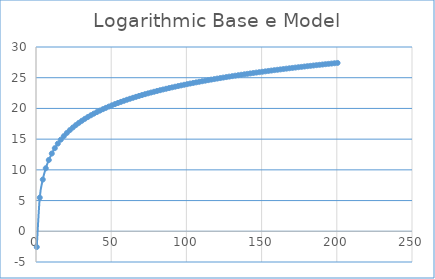
| Category | Series 0 |
|---|---|
| 0.5 | -2.566 |
| 2.5 | 5.481 |
| 4.5 | 8.42 |
| 6.5 | 10.259 |
| 8.5 | 11.6 |
| 10.5 | 12.657 |
| 12.5 | 13.529 |
| 14.5 | 14.271 |
| 16.5 | 14.917 |
| 18.5 | 15.489 |
| 20.5 | 16.002 |
| 22.5 | 16.468 |
| 24.5 | 16.893 |
| 26.5 | 17.286 |
| 28.5 | 17.65 |
| 30.5 | 17.989 |
| 32.5 | 18.306 |
| 34.5 | 18.605 |
| 36.5 | 18.887 |
| 38.5 | 19.153 |
| 40.5 | 19.407 |
| 42.5 | 19.648 |
| 44.5 | 19.877 |
| 46.5 | 20.097 |
| 48.5 | 20.308 |
| 50.5 | 20.51 |
| 52.5 | 20.704 |
| 54.5 | 20.891 |
| 56.5 | 21.071 |
| 58.5 | 21.245 |
| 60.5 | 21.413 |
| 62.5 | 21.576 |
| 64.5 | 21.733 |
| 66.5 | 21.886 |
| 68.5 | 22.034 |
| 70.5 | 22.178 |
| 72.5 | 22.318 |
| 74.5 | 22.454 |
| 76.5 | 22.586 |
| 78.5 | 22.715 |
| 80.5 | 22.841 |
| 82.5 | 22.964 |
| 84.5 | 23.084 |
| 86.5 | 23.201 |
| 88.5 | 23.315 |
| 90.5 | 23.427 |
| 92.5 | 23.536 |
| 94.5 | 23.643 |
| 96.5 | 23.748 |
| 98.5 | 23.85 |
| 100.5 | 23.951 |
| 102.5 | 24.049 |
| 104.5 | 24.146 |
| 106.5 | 24.241 |
| 108.5 | 24.334 |
| 110.5 | 24.425 |
| 112.5 | 24.515 |
| 114.5 | 24.603 |
| 116.5 | 24.689 |
| 118.5 | 24.775 |
| 120.5 | 24.858 |
| 122.5 | 24.941 |
| 124.5 | 25.022 |
| 126.5 | 25.101 |
| 128.5 | 25.18 |
| 130.5 | 25.257 |
| 132.5 | 25.333 |
| 134.5 | 25.408 |
| 136.5 | 25.482 |
| 138.5 | 25.554 |
| 140.5 | 25.626 |
| 142.5 | 25.697 |
| 144.5 | 25.766 |
| 146.5 | 25.835 |
| 148.5 | 25.903 |
| 150.5 | 25.97 |
| 152.5 | 26.036 |
| 154.5 | 26.101 |
| 156.5 | 26.165 |
| 158.5 | 26.229 |
| 160.5 | 26.291 |
| 162.5 | 26.353 |
| 164.5 | 26.415 |
| 166.5 | 26.475 |
| 168.5 | 26.535 |
| 170.5 | 26.594 |
| 172.5 | 26.652 |
| 174.5 | 26.71 |
| 176.5 | 26.767 |
| 178.5 | 26.823 |
| 180.5 | 26.879 |
| 182.5 | 26.934 |
| 184.5 | 26.988 |
| 186.5 | 27.042 |
| 188.5 | 27.095 |
| 190.5 | 27.148 |
| 192.5 | 27.2 |
| 194.5 | 27.252 |
| 196.5 | 27.303 |
| 198.5 | 27.354 |
| 200.5 | 27.404 |